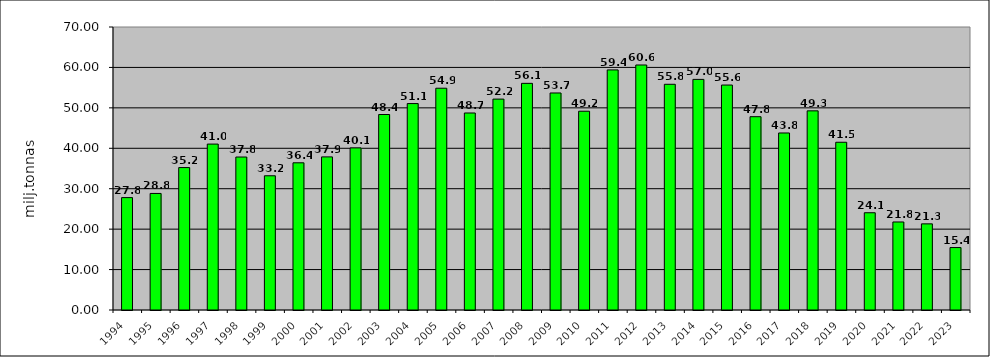
| Category | Series 0 |
|---|---|
| 1994.0 | 27.8 |
| 1995.0 | 28.83 |
| 1996.0 | 35.23 |
| 1997.0 | 41.04 |
| 1998.0 | 37.84 |
| 1999.0 | 33.199 |
| 2000.0 | 36.41 |
| 2001.0 | 37.875 |
| 2002.0 | 40.099 |
| 2003.0 | 48.355 |
| 2004.0 | 51.059 |
| 2005.0 | 54.857 |
| 2006.0 | 48.729 |
| 2007.0 | 52.164 |
| 2008.0 | 56.061 |
| 2009.0 | 53.679 |
| 2010.0 | 49.165 |
| 2011.0 | 59.385 |
| 2012.0 | 60.602 |
| 2013.0 | 55.83 |
| 2014.0 | 57.04 |
| 2015.0 | 55.644 |
| 2016.0 | 47.813 |
| 2017.0 | 43.786 |
| 2018.0 | 49.26 |
| 2019.0 | 41.492 |
| 2020.0 | 24.058 |
| 2021.0 | 21.773 |
| 2022.0 | 21.306 |
| 2023.0 | 15.447 |